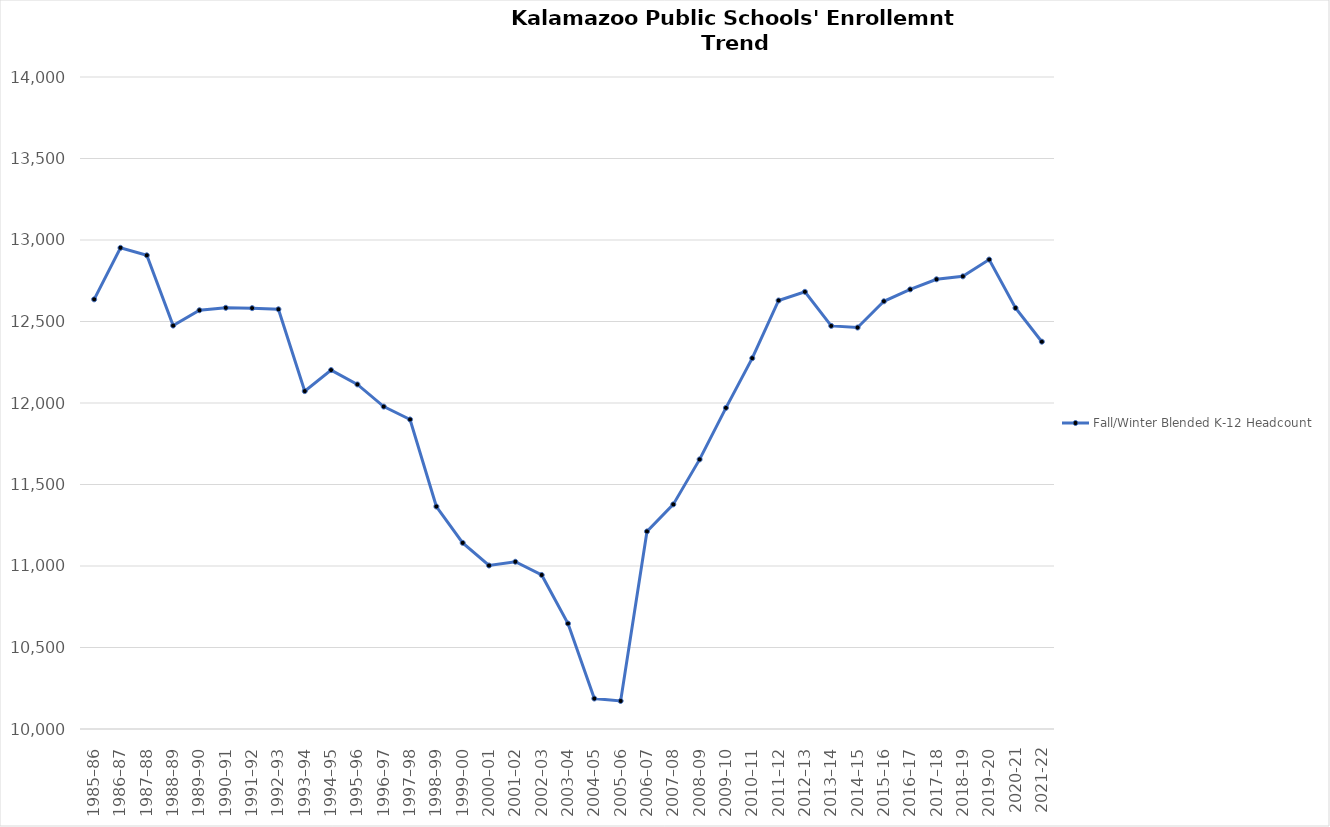
| Category | Fall/Winter Blended K-12 Headcount |
|---|---|
| 1985–86 | 12636 |
| 1986–87 | 12952 |
| 1987–88 | 12906 |
| 1988–89 | 12475 |
| 1989–90 | 12569 |
| 1990–91 | 12584 |
| 1991–92 | 12582 |
| 1992–93 | 12575 |
| 1993–94 | 12073 |
| 1994–95 | 12202 |
| 1995–96 | 12114 |
| 1996–97 | 11978 |
| 1997–98 | 11899 |
| 1998–99 | 11365 |
| 1999–00 | 11142 |
| 2000–01 | 11003 |
| 2001–02 | 11026 |
| 2002–03 | 10945 |
| 2003–04 | 10647 |
| 2004–05 | 10187 |
| 2005–06 | 10172 |
| 2006–07 | 11212 |
| 2007–08 | 11378 |
| 2008–09 | 11654 |
| 2009–10 | 11970 |
| 2010–11 | 12275 |
| 2011–12 | 12629 |
| 2012–13 | 12682 |
| 2013–14 | 12473 |
| 2014–15 | 12463 |
| 2015–16 | 12624 |
| 2016–17 | 12697 |
| 2017–18 | 12759 |
| 2018–19 | 12777 |
| 2019–20 | 12880 |
| 2020-21 | 12583 |
| 2021-22 | 12376 |